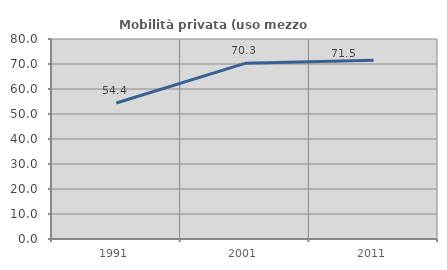
| Category | Mobilità privata (uso mezzo privato) |
|---|---|
| 1991.0 | 54.382 |
| 2001.0 | 70.276 |
| 2011.0 | 71.501 |